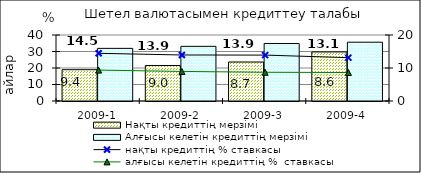
| Category | Нақты кредиттің мерзімі  | Алғысы келетін кредиттің мерзімі  |
|---|---|---|
| 2009-1 | 18.96 | 31.9 |
| 2009-2 | 21.5 | 33.13 |
| 2009-3 | 23.63 | 34.85 |
| 2009-4 | 29.73 | 35.63 |